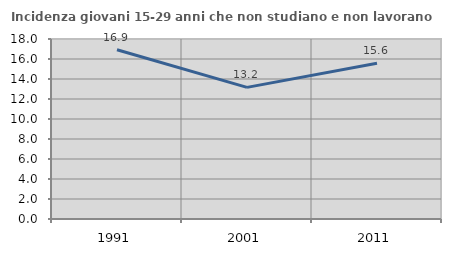
| Category | Incidenza giovani 15-29 anni che non studiano e non lavorano  |
|---|---|
| 1991.0 | 16.928 |
| 2001.0 | 13.163 |
| 2011.0 | 15.567 |